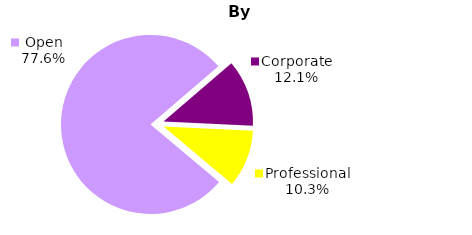
| Category | Series 0 |
|---|---|
| Open | 45 |
| Corporate | 7 |
| Professional | 6 |